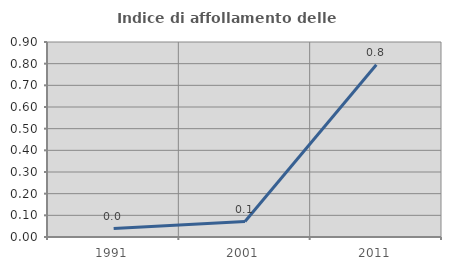
| Category | Indice di affollamento delle abitazioni  |
|---|---|
| 1991.0 | 0.039 |
| 2001.0 | 0.071 |
| 2011.0 | 0.795 |